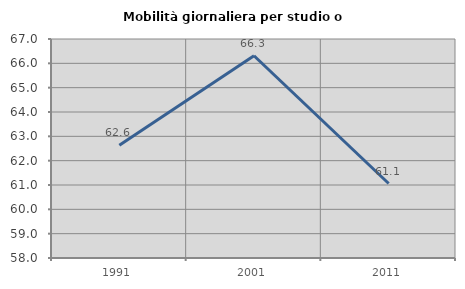
| Category | Mobilità giornaliera per studio o lavoro |
|---|---|
| 1991.0 | 62.633 |
| 2001.0 | 66.311 |
| 2011.0 | 61.06 |